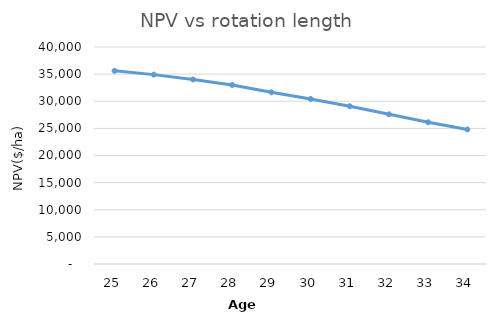
| Category | NPV |
|---|---|
| 25.0 | 35606.916 |
| 26.0 | 34908.221 |
| 27.0 | 34014.338 |
| 28.0 | 33003.507 |
| 29.0 | 31644.543 |
| 30.0 | 30431.188 |
| 31.0 | 29076.03 |
| 32.0 | 27602.099 |
| 33.0 | 26127.366 |
| 34.0 | 24801.341 |